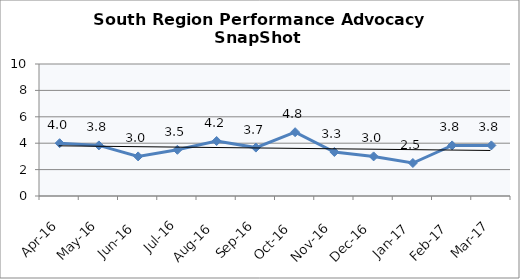
| Category | South Region |
|---|---|
| Apr-16 | 4 |
| May-16 | 3.833 |
| Jun-16 | 3 |
| Jul-16 | 3.5 |
| Aug-16 | 4.167 |
| Sep-16 | 3.667 |
| Oct-16 | 4.833 |
| Nov-16 | 3.333 |
| Dec-16 | 3 |
| Jan-17 | 2.5 |
| Feb-17 | 3.833 |
| Mar-17 | 3.833 |